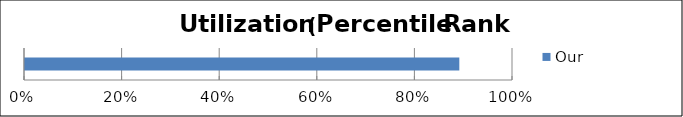
| Category | Our Clinic   |
|---|---|
| Utilization Index (Risk-Adjusted Combined Efficiency/Effectiveness) | 0.89 |